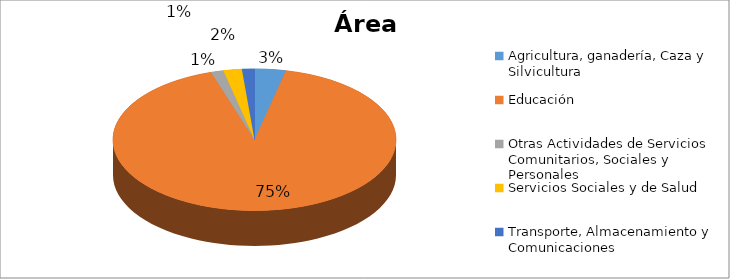
| Category | Series 0 |
|---|---|
| Agricultura, ganadería, Caza y Silvicultura | 0.029 |
| Educación | 0.754 |
| Otras Actividades de Servicios Comunitarios, Sociales y Personales | 0.012 |
| Servicios Sociales y de Salud | 0.018 |
| Transporte, Almacenamiento y Comunicaciones | 0.012 |